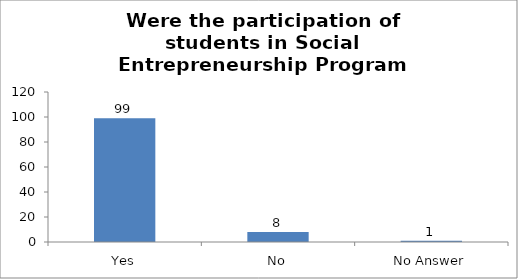
| Category | Were the participation of students in Social Entrepreneurship program appreciated by parents? |
|---|---|
| Yes | 99 |
| No | 8 |
| No Answer | 1 |